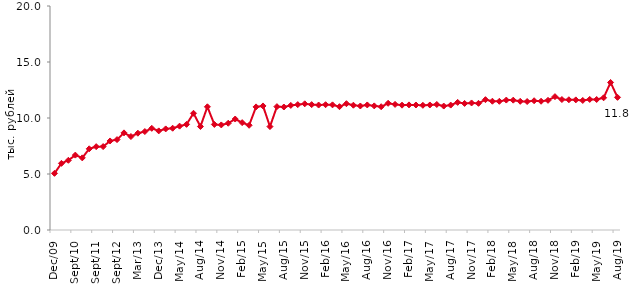
| Category | медианное значение среднедушевого располагаемого дохода, тыс. руб. |
|---|---|
| 2009-12-01 | 5.058 |
| 2010-04-01 | 5.949 |
| 2010-06-01 | 6.224 |
| 2010-09-01 | 6.686 |
| 2010-12-01 | 6.44 |
| 2011-07-01 | 7.25 |
| 2011-09-01 | 7.441 |
| 2011-12-01 | 7.446 |
| 2012-07-01 | 7.95 |
| 2012-09-01 | 8.071 |
| 2012-11-01 | 8.673 |
| 2012-12-01 | 8.345 |
| 2013-03-01 | 8.644 |
| 2013-06-01 | 8.789 |
| 2013-09-01 | 9.079 |
| 2013-12-01 | 8.849 |
| 2014-02-01 | 9.025 |
| 2014-04-01 | 9.087 |
| 2014-05-01 | 9.273 |
| 2014-06-01 | 9.432 |
| 2014-07-01 | 10.422 |
| 2014-08-01 | 9.241 |
| 2014-09-01 | 11 |
| 2014-10-01 | 9.426 |
| 2014-11-01 | 9.381 |
| 2014-12-01 | 9.532 |
| 2015-01-01 | 9.908 |
| 2015-02-01 | 9.585 |
| 2015-03-01 | 9.35 |
| 2015-04-01 | 10.991 |
| 2015-05-01 | 11.076 |
| 2015-06-01 | 9.237 |
| 2015-07-01 | 11.013 |
| 2015-08-01 | 10.981 |
| 2015-09-01 | 11.124 |
| 2015-10-01 | 11.195 |
| 2015-11-01 | 11.268 |
| 2015-12-01 | 11.194 |
| 2016-01-01 | 11.158 |
| 2016-02-01 | 11.188 |
| 2016-03-01 | 11.174 |
| 2016-04-01 | 11.01 |
| 2016-05-01 | 11.278 |
| 2016-06-01 | 11.142 |
| 2016-07-01 | 11.072 |
| 2016-08-01 | 11.165 |
| 2016-09-01 | 11.082 |
| 2016-10-01 | 11.008 |
| 2016-11-01 | 11.313 |
| 2016-12-01 | 11.216 |
| 2017-01-01 | 11.146 |
| 2017-02-01 | 11.17 |
| 2017-03-01 | 11.162 |
| 2017-04-01 | 11.133 |
| 2017-05-01 | 11.163 |
| 2017-06-01 | 11.207 |
| 2017-07-01 | 11.066 |
| 2017-08-01 | 11.153 |
| 2017-09-01 | 11.395 |
| 2017-10-01 | 11.301 |
| 2017-11-01 | 11.342 |
| 2017-12-01 | 11.31 |
| 2018-01-01 | 11.637 |
| 2018-02-01 | 11.497 |
| 2018-03-01 | 11.49 |
| 2018-04-01 | 11.601 |
| 2018-05-01 | 11.592 |
| 2018-06-01 | 11.491 |
| 2018-07-01 | 11.471 |
| 2018-08-01 | 11.541 |
| 2018-09-01 | 11.497 |
| 2018-10-01 | 11.578 |
| 2018-11-01 | 11.906 |
| 2018-12-01 | 11.648 |
| 2019-01-01 | 11.629 |
| 2019-02-01 | 11.617 |
| 2019-03-01 | 11.566 |
| 2019-04-01 | 11.659 |
| 2019-05-01 | 11.653 |
| 2019-06-01 | 11.805 |
| 2019-07-01 | 13.174 |
| 2019-08-01 | 11.844 |